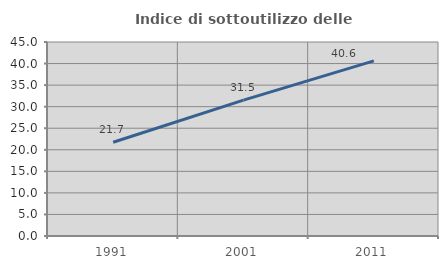
| Category | Indice di sottoutilizzo delle abitazioni  |
|---|---|
| 1991.0 | 21.742 |
| 2001.0 | 31.507 |
| 2011.0 | 40.625 |